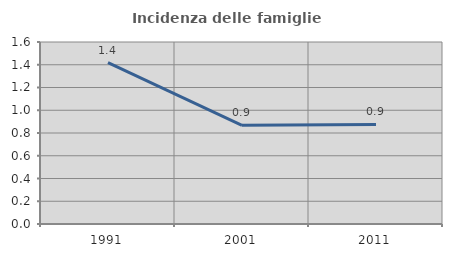
| Category | Incidenza delle famiglie numerose |
|---|---|
| 1991.0 | 1.419 |
| 2001.0 | 0.868 |
| 2011.0 | 0.875 |